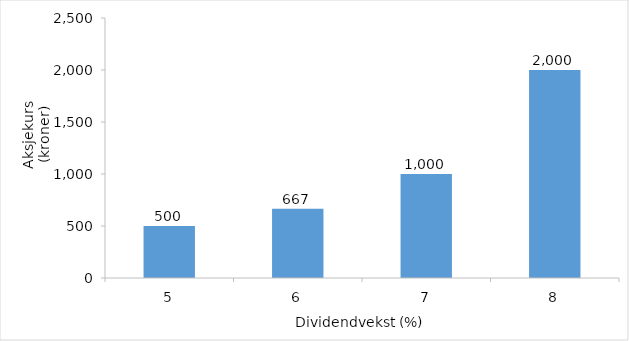
| Category | Series 0 |
|---|---|
| 5.0 | 500 |
| 6.0 | 666.667 |
| 7.0 | 1000 |
| 8.0 | 2000 |